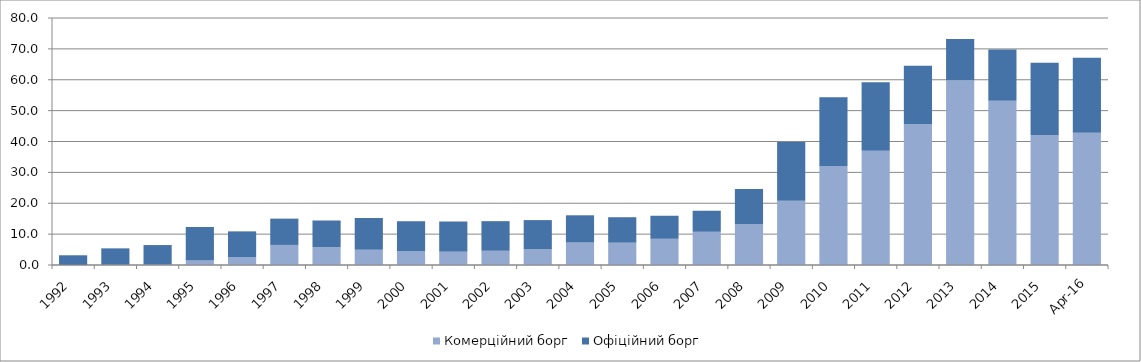
| Category | Комерційний борг | Офіційний борг |
|---|---|---|
| 1992.0 | 0.002 | 3.145 |
| 1993.0 | 0.093 | 5.294 |
| 1994.0 | 0.141 | 6.319 |
| 1995.0 | 1.452 | 10.845 |
| 1996.0 | 2.584 | 8.306 |
| 1997.0 | 6.501 | 8.515 |
| 1998.0 | 5.762 | 8.647 |
| 1999.0 | 4.91 | 10.338 |
| 2000.0 | 4.437 | 9.735 |
| 2001.0 | 4.31 | 9.775 |
| 2002.0 | 4.609 | 9.593 |
| 2003.0 | 5.066 | 9.477 |
| 2004.0 | 7.274 | 8.823 |
| 2005.0 | 7.225 | 8.249 |
| 2006.0 | 8.489 | 7.461 |
| 2007.0 | 10.762 | 6.811 |
| 2008.0 | 13.215 | 11.384 |
| 2009.0 | 20.831 | 18.982 |
| 2010.0 | 32.087 | 22.211 |
| 2011.0 | 37.025 | 22.198 |
| 2012.0 | 45.621 | 18.875 |
| 2013.0 | 59.842 | 13.321 |
| 2014.0 | 53.19 | 16.622 |
| 2015.0 | 42.095 | 23.41 |
| 42490.0 | 42.811 | 24.28 |